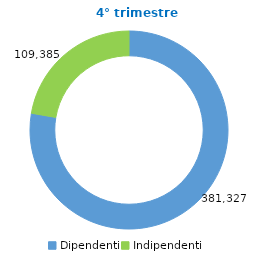
| Category |   T4-2020 |
|---|---|
| Dipendenti | 381327 |
| Indipendenti | 109385 |